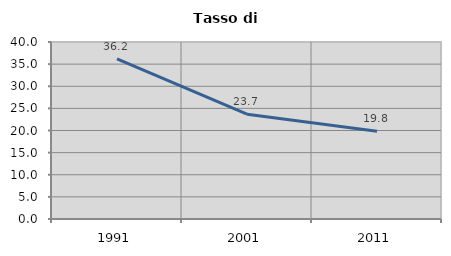
| Category | Tasso di disoccupazione   |
|---|---|
| 1991.0 | 36.176 |
| 2001.0 | 23.675 |
| 2011.0 | 19.822 |